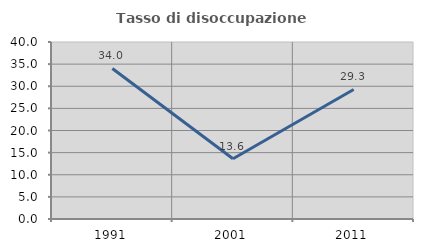
| Category | Tasso di disoccupazione giovanile  |
|---|---|
| 1991.0 | 34.025 |
| 2001.0 | 13.6 |
| 2011.0 | 29.268 |